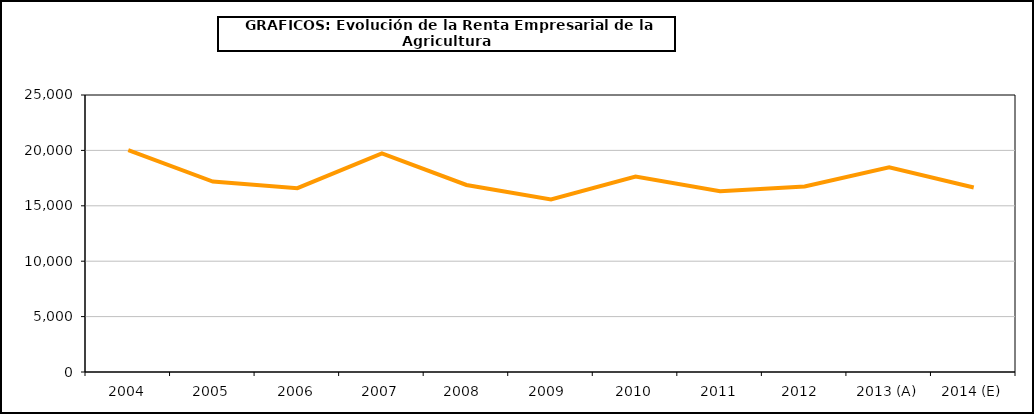
| Category | renta empresarial |
|---|---|
| 2004 | 20014.775 |
| 2005 | 17191.329 |
| 2006 | 16591.901 |
| 2007 | 19725.27 |
| 2008  | 16877.818 |
| 2009  | 15568.835 |
| 2010 | 17633.246 |
| 2011 | 16322.948 |
| 2012  | 16739.148 |
| 2013 (A) | 18464.165 |
| 2014 (E) | 16656.186 |